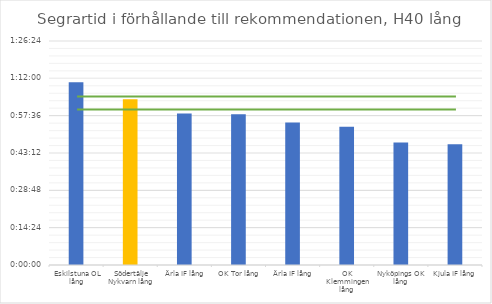
| Category | H40 tid |
|---|---|
| Eskilstuna OL lång | 0.049 |
| Södertälje Nykvarn lång | 0.044 |
| Ärla IF lång | 0.041 |
| OK Tor lång | 0.04 |
| Ärla IF lång | 0.038 |
| OK Klemmingen lång | 0.037 |
| Nyköpings OK lång | 0.033 |
| Kjula IF lång | 0.032 |